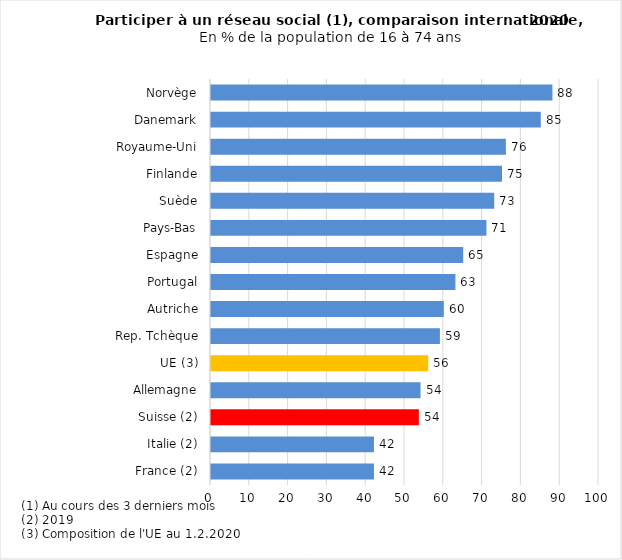
| Category | 2020 |
|---|---|
| France (2) | 42 |
| Italie (2) | 42 |
| Suisse (2) | 53.573 |
| Allemagne | 54 |
| UE (3) | 56 |
| Rep. Tchèque | 59 |
| Autriche | 60 |
| Portugal | 63 |
| Espagne | 65 |
| Pays-Bas | 71 |
| Suède | 73 |
| Finlande | 75 |
| Royaume-Uni | 76 |
| Danemark | 85 |
| Norvège | 88 |